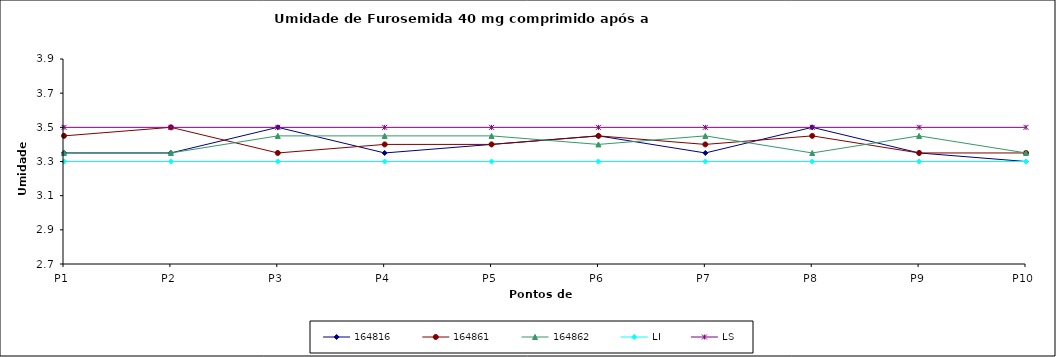
| Category | 164816 | 164861 | 164862 | LI | LS |
|---|---|---|---|---|---|
| P1 | 3.35 | 3.45 | 3.35 | 3.3 | 3.5 |
| P2 | 3.35 | 3.5 | 3.35 | 3.3 | 3.5 |
| P3 | 3.5 | 3.35 | 3.45 | 3.3 | 3.5 |
| P4 | 3.35 | 3.4 | 3.45 | 3.3 | 3.5 |
| P5 | 3.4 | 3.4 | 3.45 | 3.3 | 3.5 |
| P6 | 3.45 | 3.45 | 3.4 | 3.3 | 3.5 |
| P7 | 3.35 | 3.4 | 3.45 | 3.3 | 3.5 |
| P8 | 3.5 | 3.45 | 3.35 | 3.3 | 3.5 |
| P9 | 3.35 | 3.35 | 3.45 | 3.3 | 3.5 |
| P10 | 3.3 | 3.35 | 3.35 | 3.3 | 3.5 |